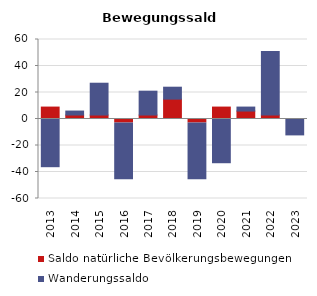
| Category | Saldo natürliche Bevölkerungsbewegungen | Wanderungssaldo |
|---|---|---|
| 2013.0 | 9 | -36 |
| 2014.0 | 3 | 3 |
| 2015.0 | 3 | 24 |
| 2016.0 | -3 | -42 |
| 2017.0 | 3 | 18 |
| 2018.0 | 15 | 9 |
| 2019.0 | -3 | -42 |
| 2020.0 | 9 | -33 |
| 2021.0 | 6 | 3 |
| 2022.0 | 3 | 48 |
| 2023.0 | 0 | -12 |